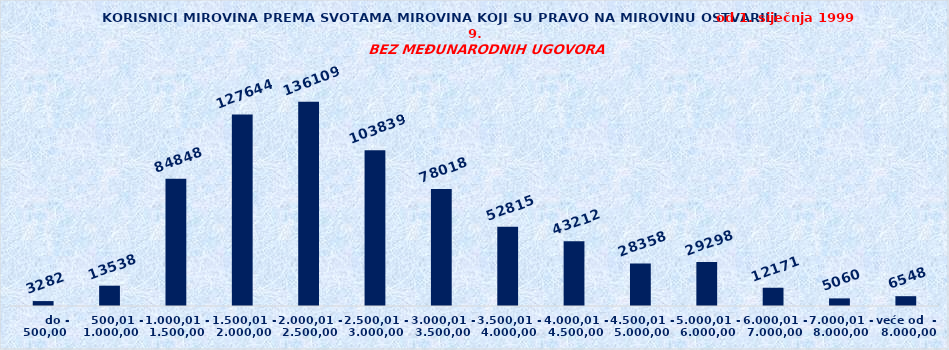
| Category | Series 0 |
|---|---|
|       do - 500,00 | 3282 |
|    500,01 - 1.000,00 | 13538 |
| 1.000,01 - 1.500,00 | 84848 |
| 1.500,01 - 2.000,00 | 127644 |
| 2.000,01 - 2.500,00 | 136109 |
| 2.500,01 - 3.000,00 | 103839 |
| 3.000,01 - 3.500,00 | 78018 |
| 3.500,01 - 4.000,00 | 52815 |
| 4.000,01 - 4.500,00 | 43212 |
| 4.500,01 - 5.000,00 | 28358 |
| 5.000,01 - 6.000,00 | 29298 |
| 6.000,01 - 7.000,00 | 12171 |
| 7.000,01 - 8.000,00 | 5060 |
| veće od  -  8.000,00 | 6548 |